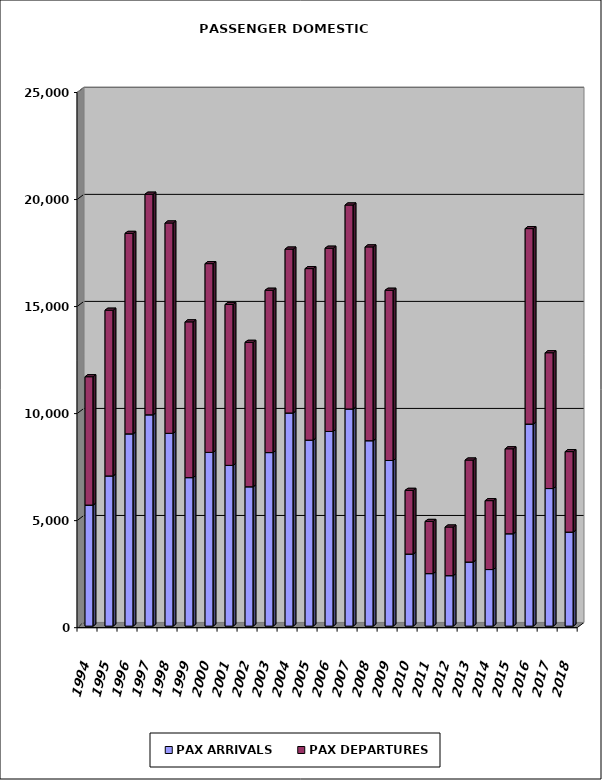
| Category | PAX ARRIVALS | PAX DEPARTURES |
|---|---|---|
| 1994.0 | 5655 | 5995 |
| 1995.0 | 7017 | 7741 |
| 1996.0 | 8982 | 9365 |
| 1997.0 | 9872 | 10305 |
| 1998.0 | 9007 | 9825 |
| 1999.0 | 6937 | 7276 |
| 2000.0 | 8116 | 8817 |
| 2001.0 | 7510 | 7515 |
| 2002.0 | 6510 | 6747 |
| 2003.0 | 8107 | 7583 |
| 2004.0 | 9957 | 7656 |
| 2005.0 | 8688 | 8013 |
| 2006.0 | 9093 | 8561 |
| 2007.0 | 10145 | 9528 |
| 2008.0 | 8662 | 9053 |
| 2009.0 | 7737 | 7953 |
| 2010.0 | 3367 | 2976 |
| 2011.0 | 2453 | 2438 |
| 2012.0 | 2358 | 2271 |
| 2013.0 | 2995 | 4763 |
| 2014.0 | 2643 | 3218 |
| 2015.0 | 4315 | 3969 |
| 2016.0 | 9440 | 9130 |
| 2017.0 | 6427 | 6344 |
| 2018.0 | 4393 | 3759 |